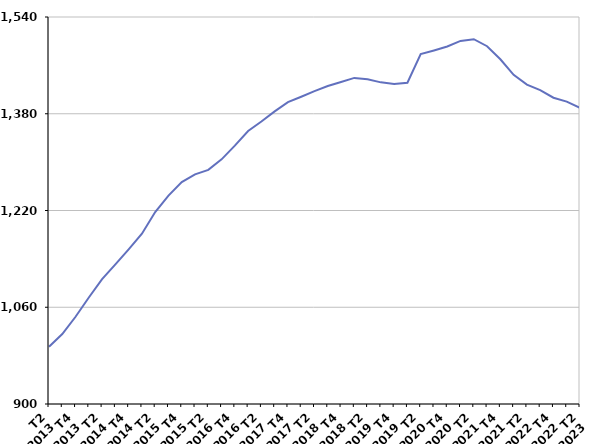
| Category | 50 ans ou plus |
|---|---|
| T2
2013 | 994.6 |
| T3
2013 | 1015.7 |
| T4
2013 | 1044.3 |
| T1
2014 | 1076.1 |
| T2
2014 | 1106.4 |
| T3
2014 | 1130.9 |
| T4
2014 | 1155.8 |
| T1
2015 | 1181.7 |
| T2
2015 | 1217.4 |
| T3
2015 | 1244.6 |
| T4
2015 | 1266.9 |
| T1
2016 | 1279.8 |
| T2
2016 | 1287.2 |
| T3
2016 | 1304.6 |
| T4
2016 | 1327.2 |
| T1
2017 | 1351.5 |
| T2
2017 | 1367.2 |
| T3
2017 | 1384 |
| T4
2017 | 1399.3 |
| T1
2018 | 1408.1 |
| T2
2018 | 1417.4 |
| T3
2018 | 1425.8 |
| T4
2018 | 1432.6 |
| T1
2019 | 1439.3 |
| T2
2019 | 1437.1 |
| T3
2019 | 1431.9 |
| T4
2019 | 1429.4 |
| T1
2020 | 1431.2 |
| T2
2020 | 1478.6 |
| T3
2020 | 1484.7 |
| T4
2020 | 1491.3 |
| T1
2021 | 1500.5 |
| T2
2021 | 1503.3 |
| T3
2021 | 1491.7 |
| T4
2021 | 1470.1 |
| T1
2022 | 1444.3 |
| T2
2022 | 1428.2 |
| T3
2022 | 1419.2 |
| T4
2022 | 1406.5 |
| T1
2023 | 1400.1 |
| T2
2023 | 1389.6 |